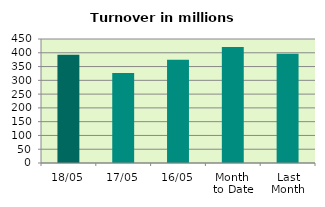
| Category | Series 0 |
|---|---|
| 18/05 | 393.114 |
| 17/05 | 326.502 |
| 16/05 | 374.625 |
| Month 
to Date | 420.89 |
| Last
Month | 396.429 |